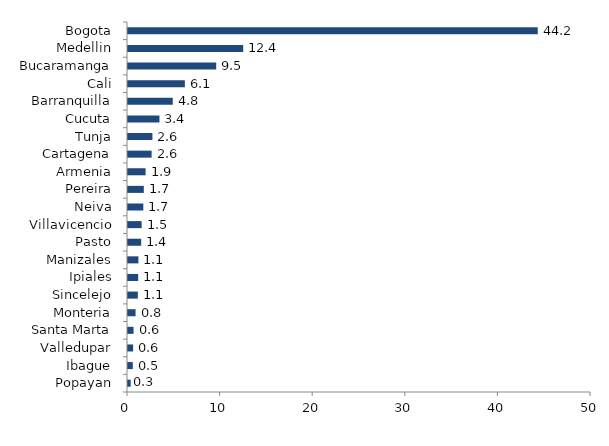
| Category | Series 0 |
|---|---|
| Popayan | 0.292 |
| Ibague | 0.52 |
| Valledupar | 0.553 |
| Santa Marta | 0.598 |
| Monteria | 0.817 |
| Sincelejo | 1.063 |
| Ipiales | 1.099 |
| Manizales | 1.124 |
| Pasto | 1.425 |
| Villavicencio | 1.473 |
| Neiva | 1.654 |
| Pereira | 1.707 |
| Armenia | 1.9 |
| Cartagena | 2.552 |
| Tunja | 2.637 |
| Cucuta | 3.396 |
| Barranquilla | 4.836 |
| Cali | 6.14 |
| Bucaramanga | 9.526 |
| Medellin | 12.44 |
| Bogota | 44.248 |